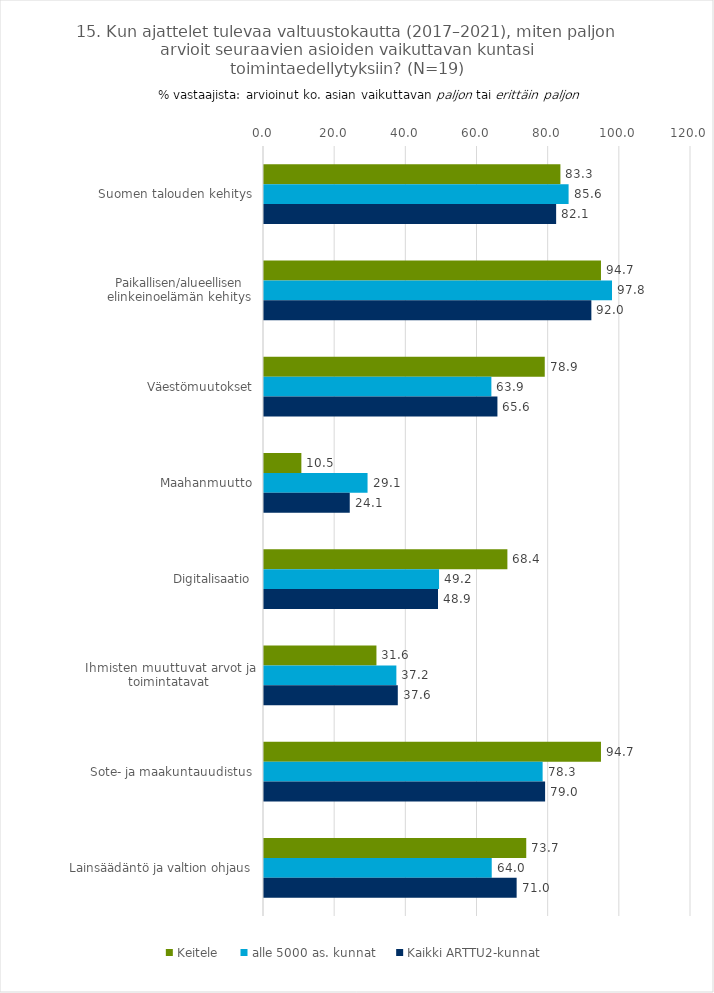
| Category | Keitele | alle 5000 as. kunnat | Kaikki ARTTU2-kunnat |
|---|---|---|---|
| Suomen talouden kehitys | 83.3 | 85.6 | 82.1 |
| Paikallisen/alueellisen elinkeinoelämän kehitys | 94.7 | 97.8 | 92 |
| Väestömuutokset | 78.9 | 63.9 | 65.6 |
| Maahanmuutto | 10.5 | 29.1 | 24.1 |
| Digitalisaatio | 68.4 | 49.2 | 48.9 |
| Ihmisten muuttuvat arvot ja toimintatavat | 31.6 | 37.2 | 37.6 |
| Sote- ja maakuntauudistus | 94.7 | 78.3 | 79 |
| Lainsäädäntö ja valtion ohjaus | 73.7 | 64 | 71 |